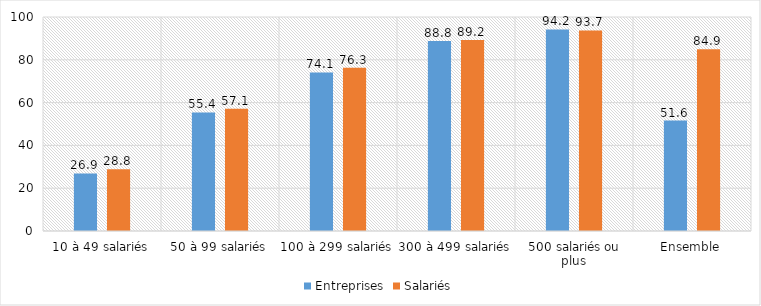
| Category | Entreprises | Salariés |
|---|---|---|
| 10 à 49 salariés | 26.9 | 28.8 |
| 50 à 99 salariés | 55.4 | 57.1 |
| 100 à 299 salariés | 74.1 | 76.3 |
| 300 à 499 salariés | 88.8 | 89.2 |
| 500 salariés ou plus | 94.2 | 93.7 |
| Ensemble | 51.6 | 84.9 |